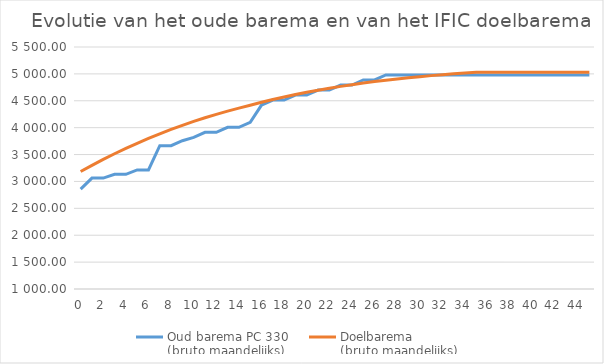
| Category | Oud barema PC 330 
(bruto maandelijks) | Doelbarema | Doelbarema 
(bruto maandelijks) |
|---|---|---|---|
| 0.0 | 2857.11 |  | 3184.94 |
| 1.0 | 3062.85 |  | 3299.6 |
| 2.0 | 3062.85 |  | 3409.48 |
| 3.0 | 3133.13 |  | 3514.5 |
| 4.0 | 3133.13 |  | 3614.64 |
| 5.0 | 3215.12 |  | 3709.9 |
| 6.0 | 3215.12 |  | 3800.34 |
| 7.0 | 3664.08 |  | 3886.04 |
| 8.0 | 3664.08 |  | 3967.1 |
| 9.0 | 3757.32 |  | 4043.64 |
| 10.0 | 3819.47 |  | 4115.82 |
| 11.0 | 3912.71 |  | 4183.77 |
| 12.0 | 3912.71 |  | 4247.65 |
| 13.0 | 4005.95 |  | 4307.65 |
| 14.0 | 4005.95 |  | 4363.93 |
| 15.0 | 4099.18 |  | 4416.68 |
| 16.0 | 4420.34 |  | 4471.55 |
| 17.0 | 4513.58 |  | 4522.92 |
| 18.0 | 4513.58 |  | 4570.99 |
| 19.0 | 4606.81 |  | 4615.93 |
| 20.0 | 4606.81 |  | 4657.91 |
| 21.0 | 4700.05 |  | 4697.09 |
| 22.0 | 4700.05 |  | 4733.65 |
| 23.0 | 4793.29 |  | 4767.7 |
| 24.0 | 4793.29 |  | 4799.45 |
| 25.0 | 4886.53 |  | 4829.01 |
| 26.0 | 4886.53 |  | 4856.52 |
| 27.0 | 4979.76 |  | 4882.11 |
| 28.0 | 4979.76 |  | 4905.9 |
| 29.0 | 4979.76 |  | 4928.01 |
| 30.0 | 4979.76 |  | 4948.57 |
| 31.0 | 4979.76 |  | 4967.66 |
| 32.0 | 4979.76 |  | 4985.38 |
| 33.0 | 4979.76 |  | 5001.84 |
| 34.0 | 4979.76 |  | 5017.11 |
| 35.0 | 4979.76 |  | 5031.28 |
| 36.0 | 4979.76 |  | 5031.28 |
| 37.0 | 4979.76 |  | 5031.28 |
| 38.0 | 4979.76 |  | 5031.28 |
| 39.0 | 4979.76 |  | 5031.28 |
| 40.0 | 4979.76 |  | 5031.28 |
| 41.0 | 4979.76 |  | 5031.28 |
| 42.0 | 4979.76 |  | 5031.28 |
| 43.0 | 4979.76 |  | 5031.28 |
| 44.0 | 4979.76 |  | 5031.28 |
| 45.0 | 4979.76 |  | 5031.28 |